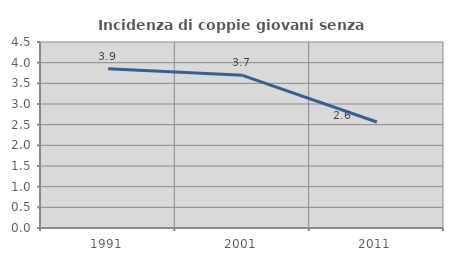
| Category | Incidenza di coppie giovani senza figli |
|---|---|
| 1991.0 | 3.855 |
| 2001.0 | 3.693 |
| 2011.0 | 2.564 |